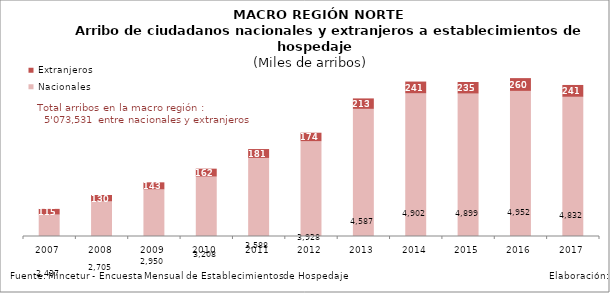
| Category | Nacionales | Extranjeros |
|---|---|---|
| 2007.0 | 2436.841 | 115.202 |
| 2008.0 | 2704.964 | 129.7 |
| 2009.0 | 2949.558 | 142.514 |
| 2010.0 | 3208.133 | 162.168 |
| 2011.0 | 3588.34 | 181.067 |
| 2012.0 | 3928.311 | 173.533 |
| 2013.0 | 4586.784 | 213.051 |
| 2014.0 | 4902.05 | 240.629 |
| 2015.0 | 4898.639 | 235.459 |
| 2016.0 | 4952.38 | 260.315 |
| 2017.0 | 4832.392 | 241.139 |